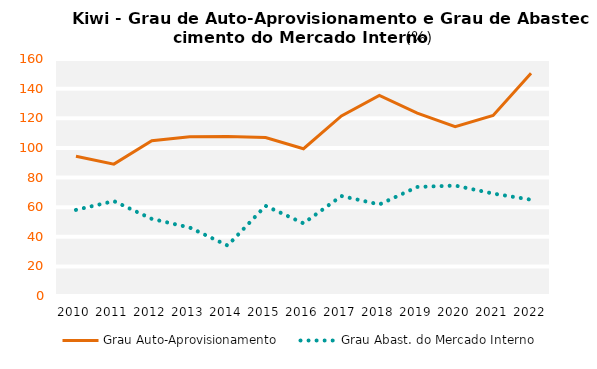
| Category | Grau Auto-Aprovisionamento | Grau Abast. do Mercado Interno |
|---|---|---|
| 2010.0 | 94.324 | 58.119 |
| 2011.0 | 89.024 | 64.069 |
| 2012.0 | 104.798 | 52.06 |
| 2013.0 | 107.436 | 46.215 |
| 2014.0 | 107.737 | 34.059 |
| 2015.0 | 106.995 | 60.861 |
| 2016.0 | 99.436 | 49.065 |
| 2017.0 | 121.579 | 67.501 |
| 2018.0 | 135.478 | 61.792 |
| 2019.0 | 123.473 | 73.616 |
| 2020.0 | 114.274 | 74.54 |
| 2021.0 | 121.833 | 69.16 |
| 2022.0 | 150.39 | 64.998 |